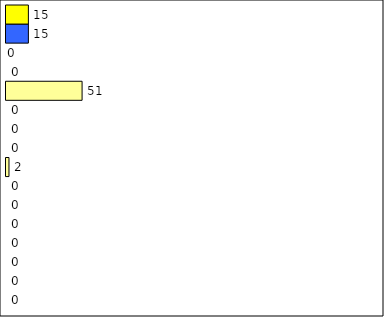
| Category | -2 | -1 | 0 | 1 | 2 | 3 | 4 | 5 | 6 | 7 | 8 | 9 | 10 | 11 | 12 | Perfect Round |
|---|---|---|---|---|---|---|---|---|---|---|---|---|---|---|---|---|
| 0 | 0 | 0 | 0 | 0 | 0 | 0 | 0 | 2 | 0 | 0 | 0 | 51 | 0 | 0 | 15 | 15 |